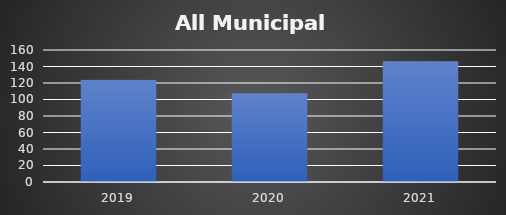
| Category | Series 0 |
|---|---|
| 2019.0 | 123.841 |
| 2020.0 | 107.528 |
| 2021.0 | 146.452 |